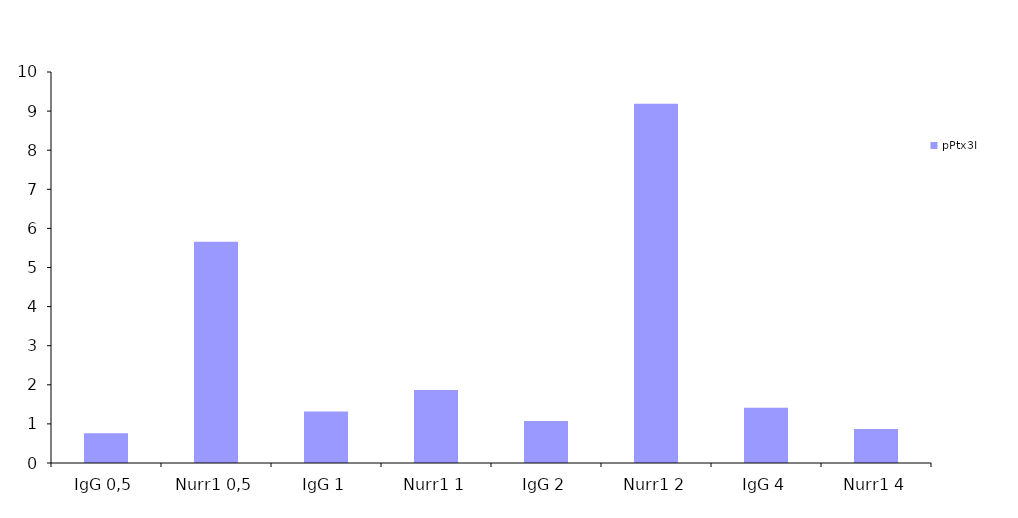
| Category | pPtx3I |
|---|---|
| IgG 0,5 | 0.758 |
| Nurr1 0,5 | 5.657 |
| IgG 1 | 1.32 |
| Nurr1 1 | 1.866 |
| IgG 2 | 1.072 |
| Nurr1 2 | 9.19 |
| IgG 4 | 1.414 |
| Nurr1 4 | 0.871 |